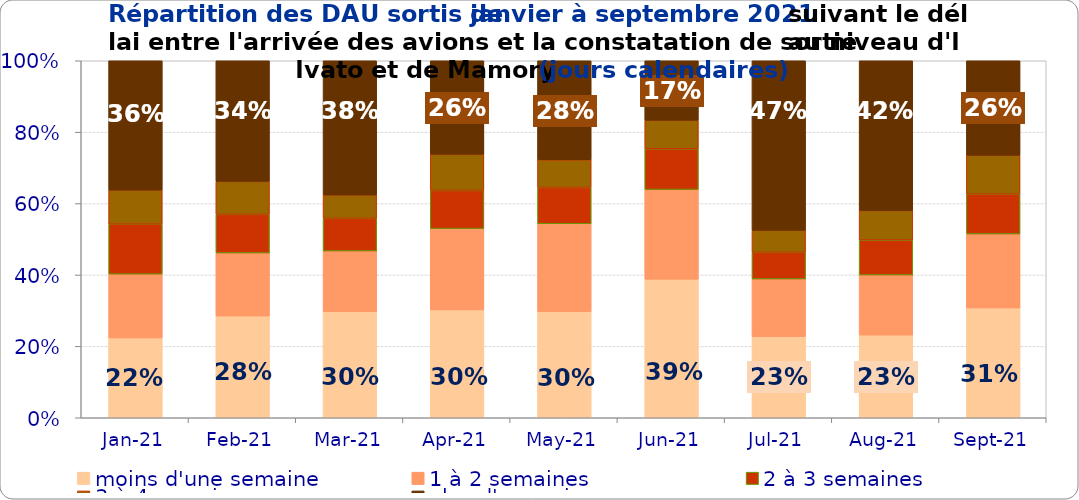
| Category | moins d'une semaine | 1 à 2 semaines | 2 à 3 semaines | 3 à 4 semaines | plus d'un mois |
|---|---|---|---|---|---|
| 2021-01-01 | 0.224 | 0.179 | 0.14 | 0.096 | 0.362 |
| 2021-02-01 | 0.285 | 0.177 | 0.108 | 0.092 | 0.338 |
| 2021-03-01 | 0.297 | 0.17 | 0.091 | 0.065 | 0.376 |
| 2021-04-01 | 0.302 | 0.228 | 0.107 | 0.101 | 0.262 |
| 2021-05-01 | 0.297 | 0.246 | 0.102 | 0.077 | 0.277 |
| 2021-06-01 | 0.388 | 0.251 | 0.114 | 0.08 | 0.167 |
| 2021-07-01 | 0.227 | 0.162 | 0.074 | 0.062 | 0.475 |
| 2021-08-01 | 0.232 | 0.169 | 0.098 | 0.083 | 0.419 |
| 2021-09-01 | 0.308 | 0.207 | 0.111 | 0.109 | 0.265 |